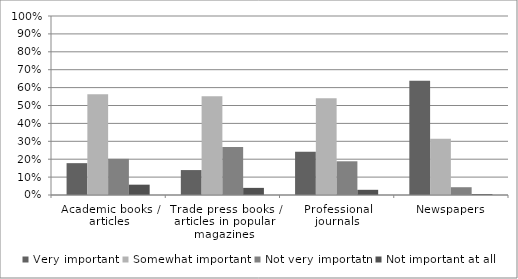
| Category | Very important | Somewhat important | Not very importatn | Not important at all |
|---|---|---|---|---|
| Academic books / articles | 0.178 | 0.562 | 0.202 | 0.058 |
| Trade press books / articles in popular magazines | 0.139 | 0.552 | 0.269 | 0.04 |
| Professional journals | 0.242 | 0.541 | 0.188 | 0.029 |
| Newspapers | 0.638 | 0.314 | 0.043 | 0.005 |